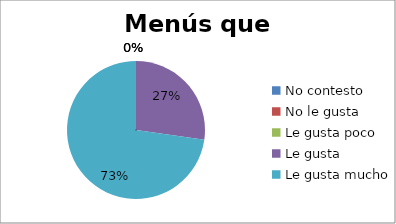
| Category | Series 0 |
|---|---|
| No contesto | 0 |
| No le gusta | 0 |
| Le gusta poco | 0 |
| Le gusta | 3 |
| Le gusta mucho | 8 |